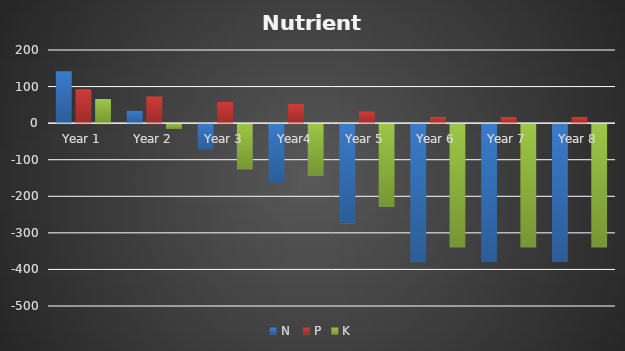
| Category | N  | P | K |
|---|---|---|---|
| Year 1 | 142.233 | 92.94 | 65.952 |
| Year 2 | 33.533 | 72.94 | -13.348 |
| Year 3 | -70.067 | 58.14 | -124.148 |
| Year4 | -160.067 | 52.14 | -140.148 |
| Year 5 | -271.667 | 31.89 | -226.548 |
| Year 6 | -375.267 | 17.09 | -337.348 |
| Year 7 | -375.267 | 17.09 | -337.348 |
| Year 8 | -375.267 | 17.09 | -337.348 |